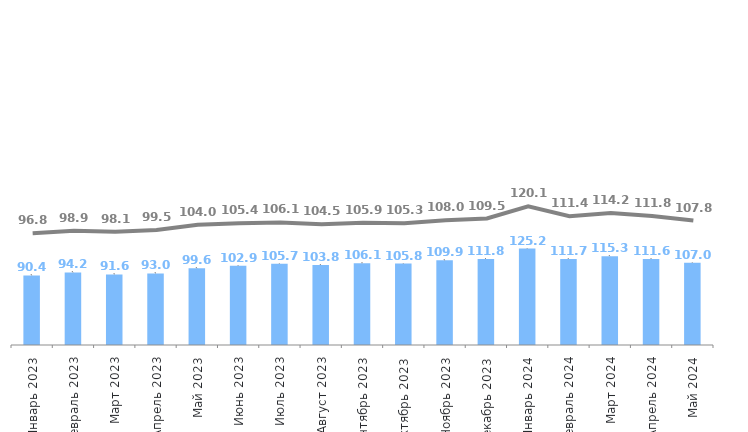
| Category | B |
|---|---|
| Январь 2023 | 90.398 |
| Февраль 2023 | 94.215 |
| Март 2023 | 91.621 |
| Апрель 2023 | 92.989 |
| Май 2023 | 99.592 |
| Июнь 2023 | 102.874 |
| Июль 2023 | 105.672 |
| Август 2023 | 103.815 |
| Сентябрь 2023 | 106.11 |
| Октябрь 2023 | 105.797 |
| Ноябрь 2023 | 109.909 |
| Декабрь 2023 | 111.758 |
| Январь 2024 | 125.203 |
| Февраль 2024 | 111.733 |
| Март 2024 | 115.335 |
| Апрель 2024 | 111.648 |
| Май 2024 | 106.957 |